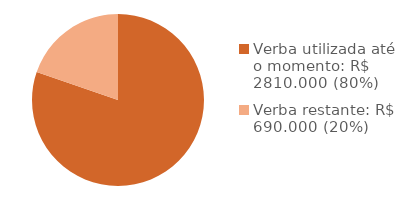
| Category | Series 0 |
|---|---|
| Verba utilizada até o momento: R$ 2810.000 (80%) | 2810 |
| Verba restante: R$ 690.000 (20%) | 690 |